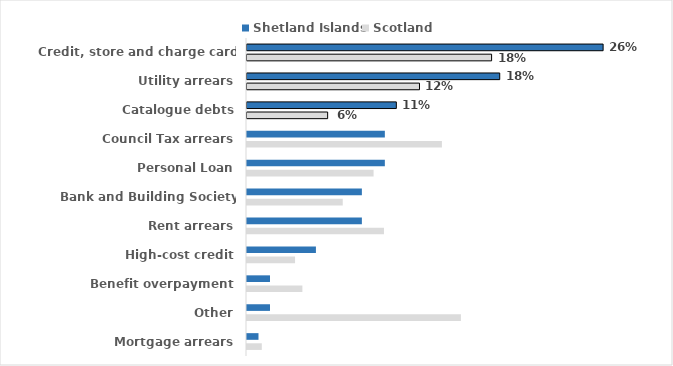
| Category | Shetland Islands | Scotland |
|---|---|---|
| Credit, store and charge card debts | 0.256 | 0.176 |
| Utility arrears | 0.182 | 0.124 |
| Catalogue debts | 0.107 | 0.058 |
| Council Tax arrears | 0.099 | 0.14 |
| Personal Loan | 0.099 | 0.091 |
| Bank and Building Society overdrafts | 0.083 | 0.069 |
| Rent arrears | 0.083 | 0.099 |
| High-cost credit | 0.05 | 0.035 |
| Benefit overpayment | 0.017 | 0.04 |
| Other | 0.017 | 0.154 |
| Mortgage arrears | 0.008 | 0.011 |